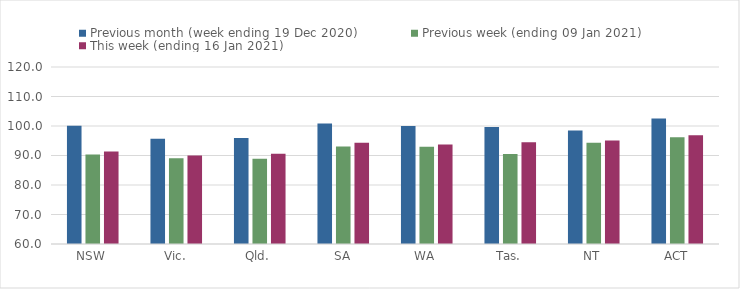
| Category | Previous month (week ending 19 Dec 2020) | Previous week (ending 09 Jan 2021) | This week (ending 16 Jan 2021) |
|---|---|---|---|
| NSW | 100.08 | 90.36 | 91.38 |
| Vic. | 95.68 | 89.03 | 90.04 |
| Qld. | 95.94 | 88.87 | 90.56 |
| SA | 100.87 | 93.07 | 94.3 |
| WA | 99.99 | 92.95 | 93.77 |
| Tas. | 99.67 | 90.55 | 94.51 |
| NT | 98.46 | 94.35 | 95.06 |
| ACT | 102.51 | 96.16 | 96.89 |